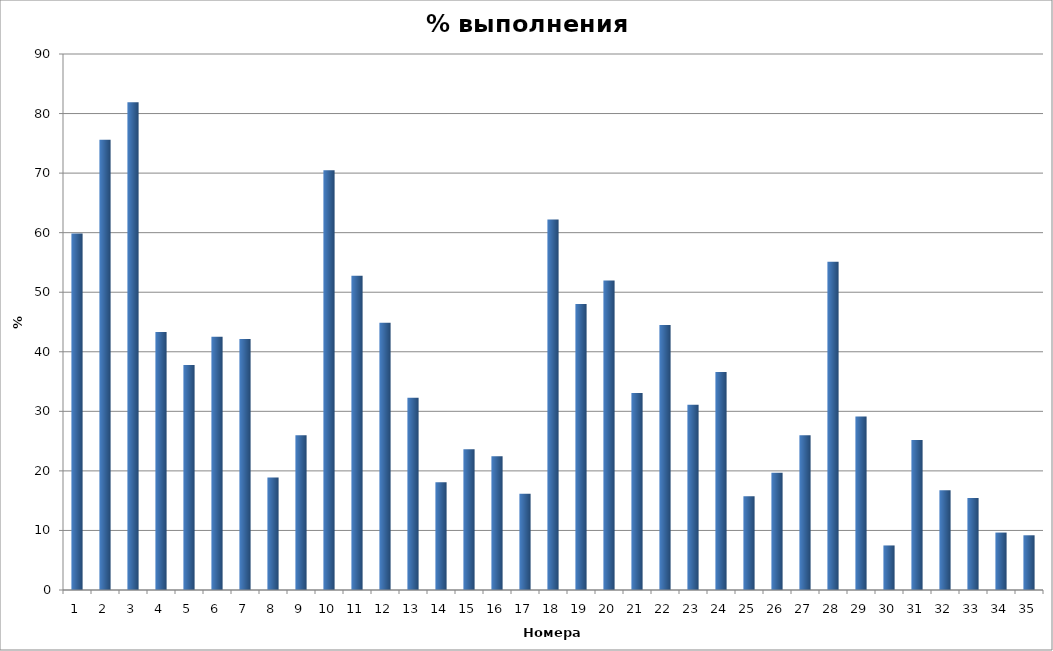
| Category | % выполнения |
|---|---|
| 0 | 59.843 |
| 1 | 75.591 |
| 2 | 81.89 |
| 3 | 43.307 |
| 4 | 37.795 |
| 5 | 42.52 |
| 6 | 42.126 |
| 7 | 18.898 |
| 8 | 25.984 |
| 9 | 70.472 |
| 10 | 52.756 |
| 11 | 44.882 |
| 12 | 32.283 |
| 13 | 18.11 |
| 14 | 23.622 |
| 15 | 22.441 |
| 16 | 16.142 |
| 17 | 62.205 |
| 18 | 48.031 |
| 19 | 51.969 |
| 20 | 33.071 |
| 21 | 44.488 |
| 22 | 31.102 |
| 23 | 36.614 |
| 24 | 15.748 |
| 25 | 19.685 |
| 26 | 25.984 |
| 27 | 55.118 |
| 28 | 29.134 |
| 29 | 7.48 |
| 30 | 25.197 |
| 31 | 16.732 |
| 32 | 15.433 |
| 33 | 9.646 |
| 34 | 9.186 |